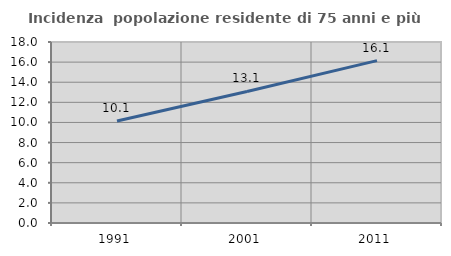
| Category | Incidenza  popolazione residente di 75 anni e più |
|---|---|
| 1991.0 | 10.143 |
| 2001.0 | 13.079 |
| 2011.0 | 16.145 |